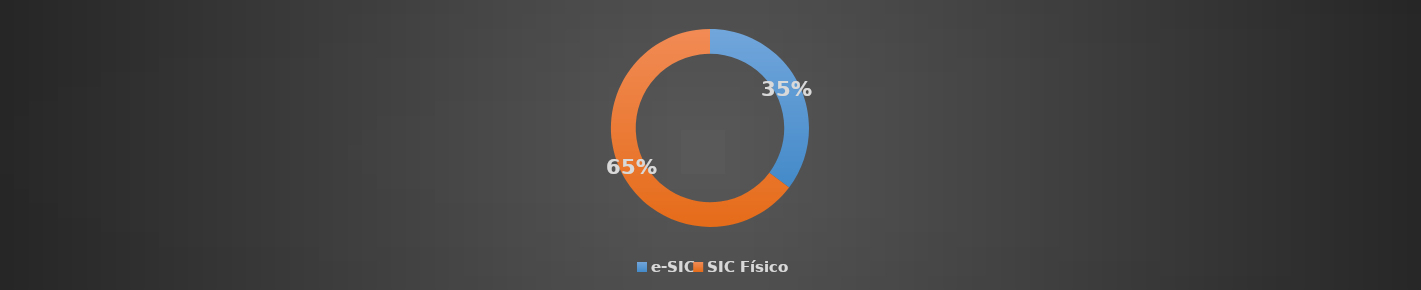
| Category | Total |
|---|---|
| e-SIC | 0.353 |
| SIC Físico | 0.647 |